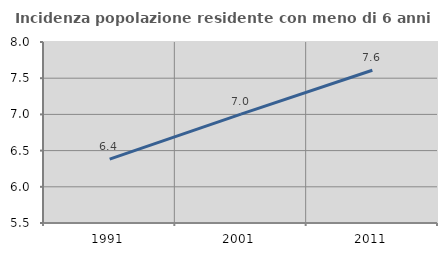
| Category | Incidenza popolazione residente con meno di 6 anni |
|---|---|
| 1991.0 | 6.382 |
| 2001.0 | 7.004 |
| 2011.0 | 7.61 |